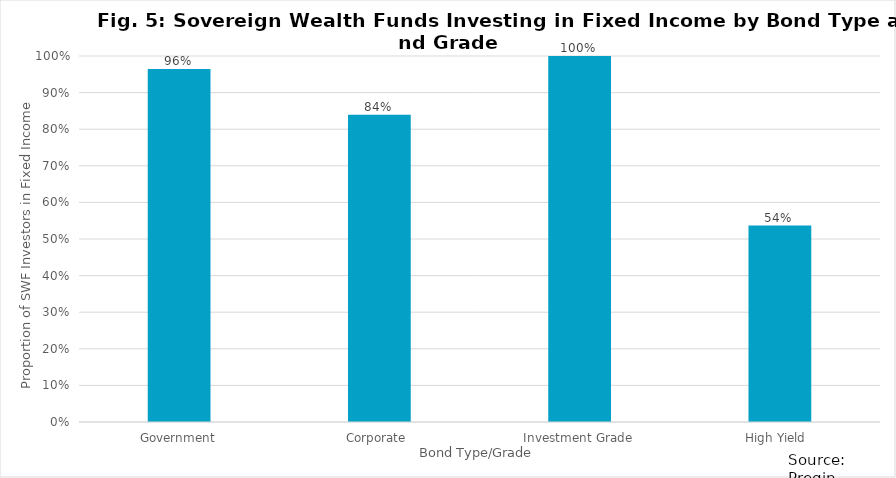
| Category | Series 0 |
|---|---|
| Government | 0.964 |
| Corporate  | 0.839 |
| Investment Grade | 1 |
| High Yield  | 0.537 |